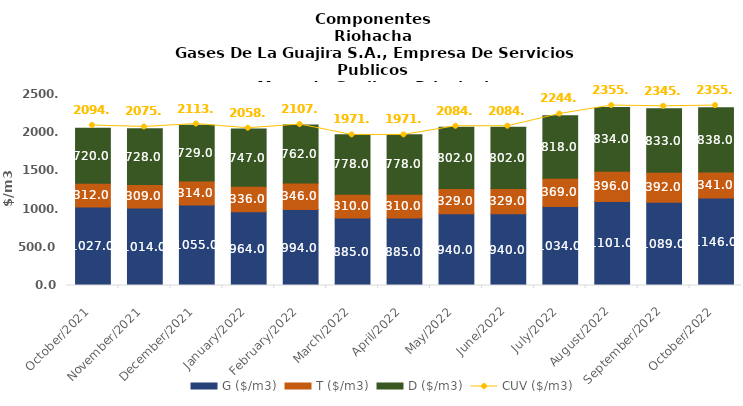
| Category | G ($/m3) | T ($/m3) | D ($/m3) |
|---|---|---|---|
| 2021-10-01 | 1027 | 312 | 720 |
| 2021-11-01 | 1014 | 309 | 728 |
| 2021-12-01 | 1055 | 314 | 729 |
| 2022-01-01 | 964 | 336 | 747 |
| 2022-02-01 | 994 | 346 | 762 |
| 2022-03-01 | 885 | 310 | 778 |
| 2022-04-01 | 885 | 310 | 778 |
| 2022-05-01 | 940 | 329 | 802 |
| 2022-06-01 | 940 | 329 | 802 |
| 2022-07-01 | 1034 | 369 | 818 |
| 2022-08-01 | 1101 | 396 | 834 |
| 2022-09-01 | 1089 | 392 | 833 |
| 2022-10-01 | 1146 | 341 | 838 |